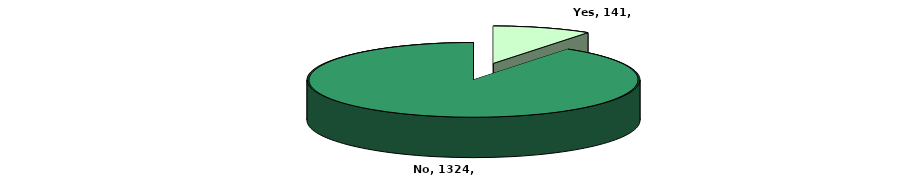
| Category | Series 0 |
|---|---|
| Yes | 141 |
| No | 1324 |